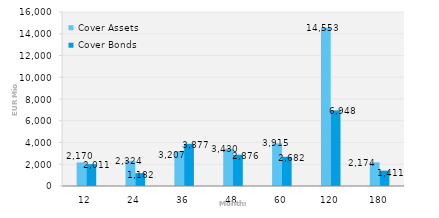
| Category | Cover Assets | Cover Bonds |
|---|---|---|
| 12.0 | 2170.274 | 2011.026 |
| 24.0 | 2323.949 | 1182 |
| 36.0 | 3207.454 | 3877 |
| 48.0 | 3429.568 | 2875.5 |
| 60.0 | 3914.662 | 2682 |
| 120.0 | 14553.199 | 6948 |
| 180.0 | 2173.975 | 1411 |